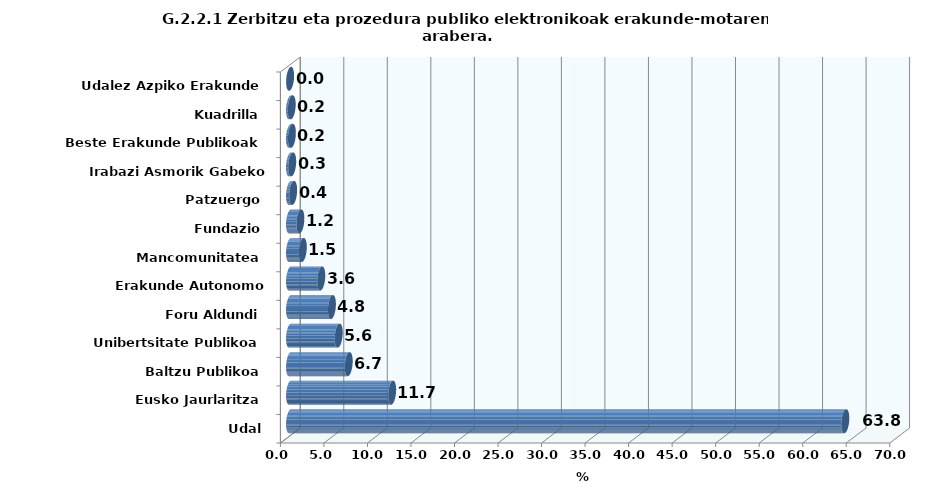
| Category | 2016 |
|---|---|
| Udal | 63.795 |
| Eusko Jaurlaritza | 11.736 |
| Baltzu Publikoa | 6.745 |
| Unibertsitate Publikoa | 5.6 |
| Foru Aldundi | 4.817 |
| Erakunde Autonomo Administratiboa | 3.593 |
| Mancomunitatea | 1.473 |
| Fundazio | 1.194 |
| Patzuergo | 0.363 |
| Irabazi Asmorik Gabeko Erakunde | 0.252 |
| Beste Erakunde Publikoak | 0.219 |
| Kuadrilla | 0.198 |
| Udalez Azpiko Erakunde | 0.015 |